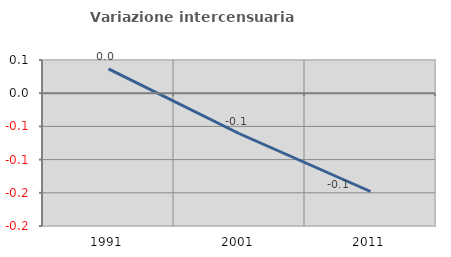
| Category | Variazione intercensuaria annua |
|---|---|
| 1991.0 | 0.037 |
| 2001.0 | -0.061 |
| 2011.0 | -0.148 |